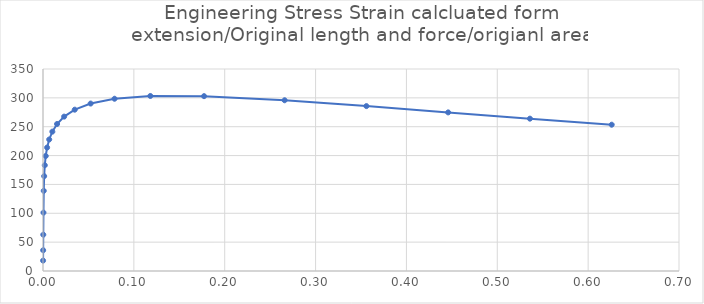
| Category | Series 0 |
|---|---|
| 9e-05 | 17.998 |
| 0.00018 | 35.993 |
| 0.000315 | 62.917 |
| 0.0005175 | 101.182 |
| 0.00082125 | 138.924 |
| 0.00127688 | 164.373 |
| 0.00196031 | 183.237 |
| 0.00298547 | 199.25 |
| 0.0045232 | 213.916 |
| 0.0068298 | 227.888 |
| 0.0102897 | 241.468 |
| 0.0154796 | 254.718 |
| 0.0232643 | 267.508 |
| 0.0349415 | 279.525 |
| 0.0524573 | 290.128 |
| 0.0787309 | 298.458 |
| 0.118141 | 303.259 |
| 0.177257 | 302.954 |
| 0.265931 | 295.842 |
| 0.355931 | 285.72 |
| 0.445931 | 274.814 |
| 0.535931 | 263.952 |
| 0.625931 | 253.483 |